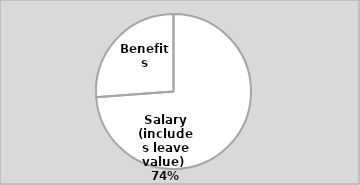
| Category | Series 0 |
|---|---|
| Salary (includes leave value)  | 60000 |
| Benefits | 21280.176 |